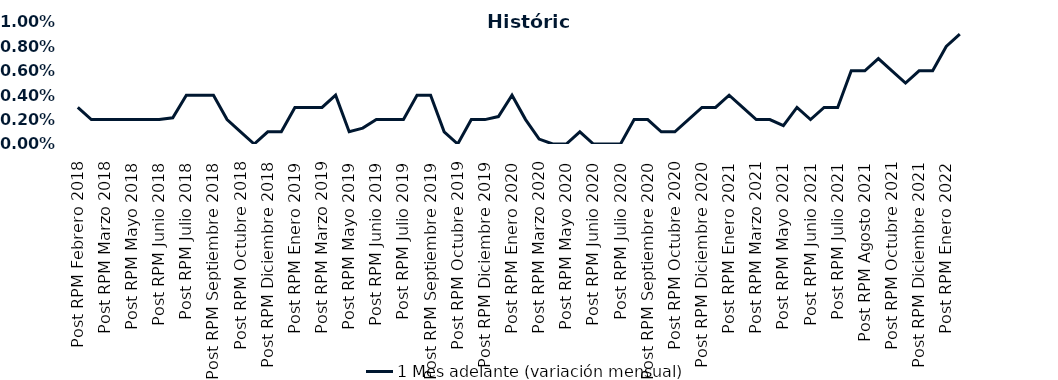
| Category | 1 Mes adelante (variación mensual) |
|---|---|
| Post RPM Febrero 2018 | 0.003 |
| Pre RPM Marzo 2018 | 0.002 |
| Post RPM Marzo 2018 | 0.002 |
| Pre RPM Mayo 2018 | 0.002 |
| Post RPM Mayo 2018 | 0.002 |
| Pre RPM Junio 2018 | 0.002 |
| Post RPM Junio 2018 | 0.002 |
| Pre RPM Julio 2018 | 0.002 |
| Post RPM Julio 2018 | 0.004 |
| Pre RPM Septiembre 2018 | 0.004 |
| Post RPM Septiembre 2018 | 0.004 |
| Pre RPM Octubre 2018 | 0.002 |
| Post RPM Octubre 2018 | 0.001 |
| Pre RPM Diciembre 2018 | 0 |
| Post RPM Diciembre 2018 | 0.001 |
| Pre RPM Enero 2019 | 0.001 |
| Post RPM Enero 2019 | 0.003 |
| Pre RPM Marzo 2019 | 0.003 |
| Post RPM Marzo 2019 | 0.003 |
| Pre RPM Mayo 2019 | 0.004 |
| Post RPM Mayo 2019 | 0.001 |
| Pre RPM Junio 2019 | 0.001 |
| Post RPM Junio 2019 | 0.002 |
| Pre RPM Julio 2019 | 0.002 |
| Post RPM Julio 2019 | 0.002 |
| Pre RPM Septiembre 2019 | 0.004 |
| Post RPM Septiembre 2019 | 0.004 |
| Pre RPM Octubre 2019 | 0.001 |
| Post RPM Octubre 2019 | 0 |
| Pre RPM Diciembre 2019 | 0.002 |
| Post RPM Diciembre 2019 | 0.002 |
| Pre RPM Enero 2020 | 0.002 |
| Post RPM Enero 2020 | 0.004 |
| Pre RPM Marzo 2020 | 0.002 |
| Post RPM Marzo 2020 | 0 |
| Pre RPM Mayo 2020 | 0 |
| Post RPM Mayo 2020 | 0 |
| Pre RPM Junio 2020 | 0.001 |
| Post RPM Junio 2020 | 0 |
| Pre RPM Julio 2020 | 0 |
| Post RPM Julio 2020 | 0 |
| Pre RPM Septiembre 2020 | 0.002 |
| Post RPM Septiembre 2020 | 0.002 |
| Pre RPM Octubre 2020 | 0.001 |
| Post RPM Octubre 2020 | 0.001 |
| Pre RPM Diciembre 2020 | 0.002 |
| Post RPM Diciembre 2020 | 0.003 |
| Pre RPM Enero 2021 | 0.003 |
| Post RPM Enero 2021 | 0.004 |
| Pre RPM Marzo 2021 | 0.003 |
| Post RPM Marzo 2021 | 0.002 |
| Pre RPM Mayo 2021 | 0.002 |
| Post RPM Mayo 2021 | 0.002 |
| Pre RPM Junio 2021 | 0.003 |
| Post RPM Junio 2021 | 0.002 |
| Pre RPM Julio 2021 | 0.003 |
| Post RPM Julio 2021 | 0.003 |
| Pre RPM Agosto 2021 | 0.006 |
| Post RPM Agosto 2021 | 0.006 |
| Pre RPM Octubre 2021 | 0.007 |
| Post RPM Octubre 2021 | 0.006 |
| Pre RPM Diciembre 2021 | 0.005 |
| Post RPM Diciembre 2021 | 0.006 |
| Pre RPM Enero 2022 | 0.006 |
| Post RPM Enero 2022 | 0.008 |
| Pre RPM Marzo 2022 | 0.009 |